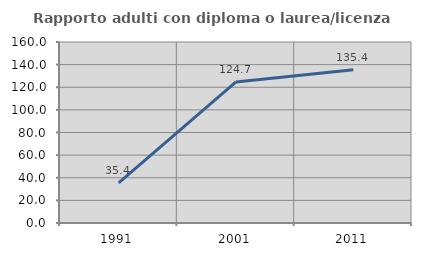
| Category | Rapporto adulti con diploma o laurea/licenza media  |
|---|---|
| 1991.0 | 35.39 |
| 2001.0 | 124.735 |
| 2011.0 | 135.43 |